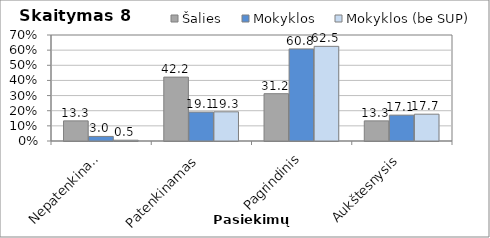
| Category | Šalies | Mokyklos | Mokyklos (be SUP) |
|---|---|---|---|
| Nepatenkinamas | 13.287 | 3.015 | 0.521 |
| Patenkinamas | 42.191 | 19.095 | 19.271 |
| Pagrindinis | 31.235 | 60.804 | 62.5 |
| Aukštesnysis | 13.287 | 17.085 | 17.708 |